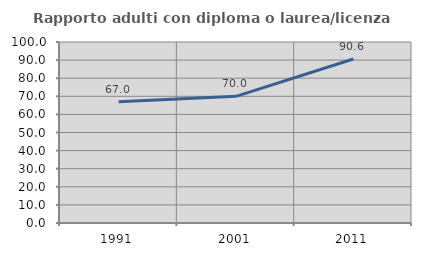
| Category | Rapporto adulti con diploma o laurea/licenza media  |
|---|---|
| 1991.0 | 66.972 |
| 2001.0 | 69.968 |
| 2011.0 | 90.596 |